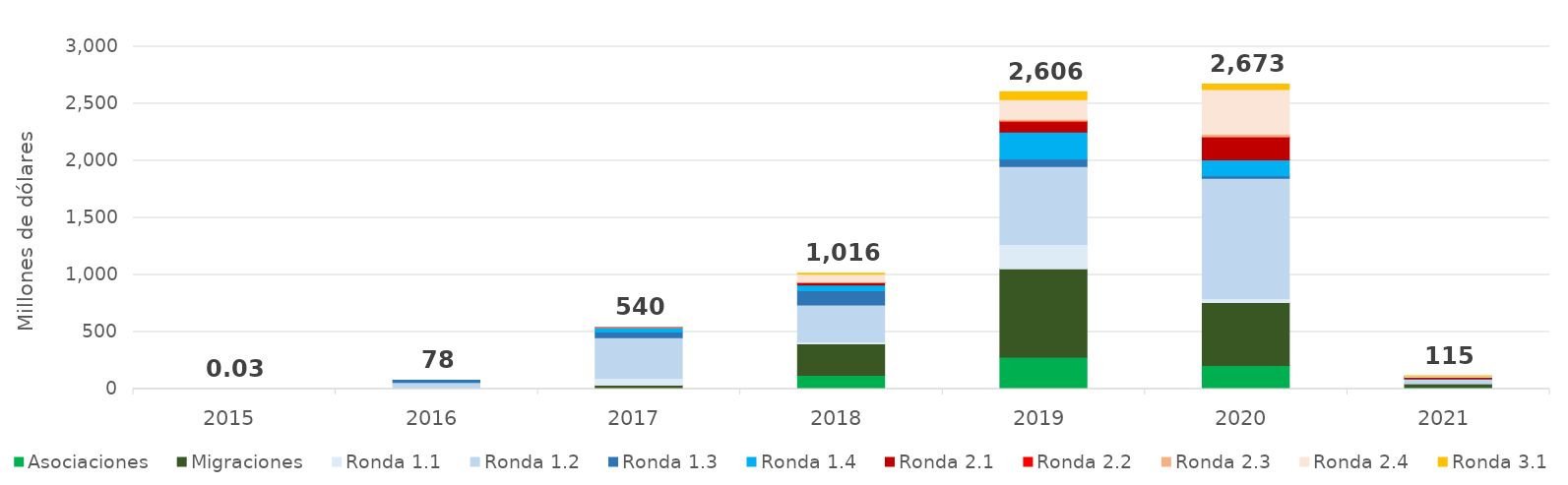
| Category | Asociaciones | Migraciones | Ronda 1.1 | Ronda 1.2 | Ronda 1.3 | Ronda 1.4 | Ronda 2.1 | Ronda 2.2 | Ronda 2.3 | Ronda 2.4 | Ronda 3.1 |
|---|---|---|---|---|---|---|---|---|---|---|---|
| 2015.0 | 0 | 0 | 0.023 | 0.003 | 0 | 0 | 0 | 0 | 0 | 0 | 0 |
| 2016.0 | 0 | 0 | 7.936 | 50.902 | 19.085 | 0 | 0 | 0 | 0 | 0 | 0 |
| 2017.0 | 1.551 | 32.93 | 60.276 | 356.292 | 49.062 | 38.707 | 0.93 | 0 | 0.096 | 0 | 0 |
| 2018.0 | 121.371 | 276.221 | 16.154 | 323.201 | 126.084 | 47.616 | 21.584 | 0.843 | 6.737 | 66.16 | 9.669 |
| 2019.0 | 280.617 | 772.208 | 213.486 | 685.106 | 64.244 | 235.595 | 88.72 | 9.392 | 14.554 | 173.042 | 69.349 |
| 2020.0 | 207.708 | 550.53 | 33.998 | 1054.149 | 22.253 | 140.295 | 198.226 | 3.04 | 23.885 | 391.695 | 46.857 |
| 2021.0 | 13.419 | 33.161 | 3.17 | 37.561 | 2.795 | 1.044 | 14.355 | 0.043 | 0.706 | 8.562 | 0.631 |